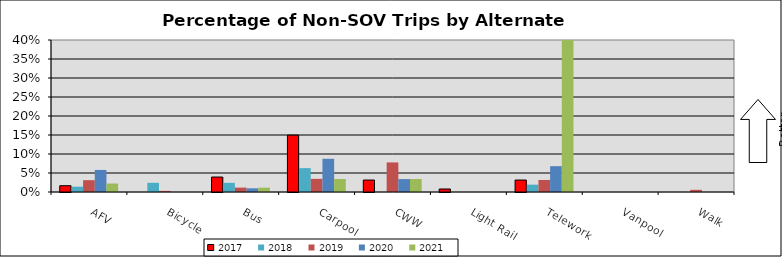
| Category | 2017 | 2018 | 2019 | 2020 | 2021 |
|---|---|---|---|---|---|
| AFV | 0.017 | 0.014 | 0.031 | 0.058 | 0.022 |
| Bicycle | 0 | 0.024 | 0.003 | 0 | 0 |
| Bus | 0.039 | 0.024 | 0.012 | 0.01 | 0.011 |
| Carpool | 0.15 | 0.063 | 0.035 | 0.087 | 0.034 |
| CWW | 0.031 | 0 | 0.078 | 0.034 | 0.034 |
| Light Rail | 0.008 | 0 | 0 | 0 | 0 |
| Telework | 0.031 | 0.019 | 0.032 | 0.068 | 0.411 |
| Vanpool | 0 | 0 | 0 | 0 | 0 |
| Walk | 0 | 0 | 0.006 | 0 | 0 |